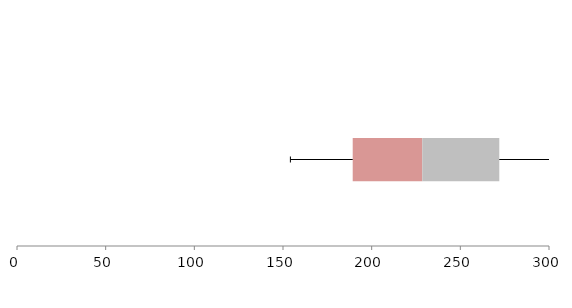
| Category | Series 1 | Series 2 | Series 3 |
|---|---|---|---|
| 0 | 189.312 | 39.239 | 43.421 |